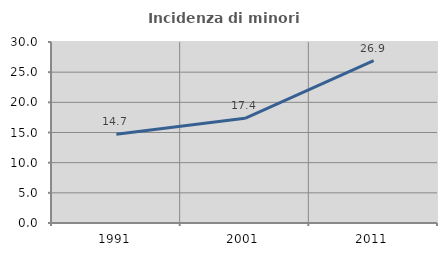
| Category | Incidenza di minori stranieri |
|---|---|
| 1991.0 | 14.706 |
| 2001.0 | 17.355 |
| 2011.0 | 26.932 |